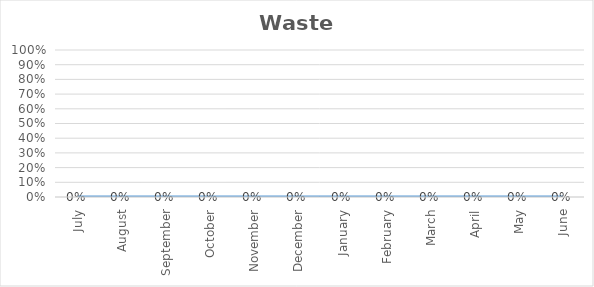
| Category | Waste Water |
|---|---|
| July | 0 |
| August | 0 |
| September | 0 |
| October | 0 |
| November | 0 |
| December | 0 |
| January | 0 |
| February | 0 |
| March | 0 |
| April | 0 |
| May | 0 |
| June | 0 |